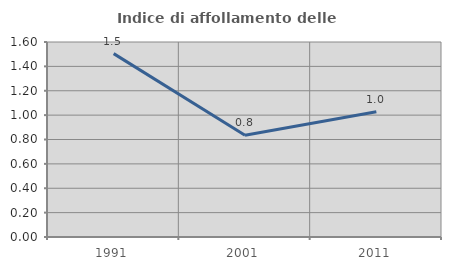
| Category | Indice di affollamento delle abitazioni  |
|---|---|
| 1991.0 | 1.505 |
| 2001.0 | 0.834 |
| 2011.0 | 1.028 |